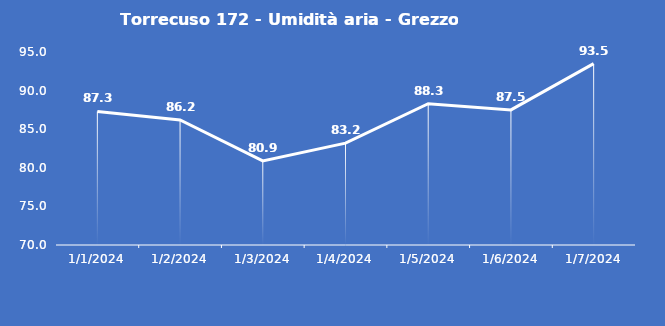
| Category | Torrecuso 172 - Umidità aria - Grezzo (%) |
|---|---|
| 1/1/24 | 87.3 |
| 1/2/24 | 86.2 |
| 1/3/24 | 80.9 |
| 1/4/24 | 83.2 |
| 1/5/24 | 88.3 |
| 1/6/24 | 87.5 |
| 1/7/24 | 93.5 |